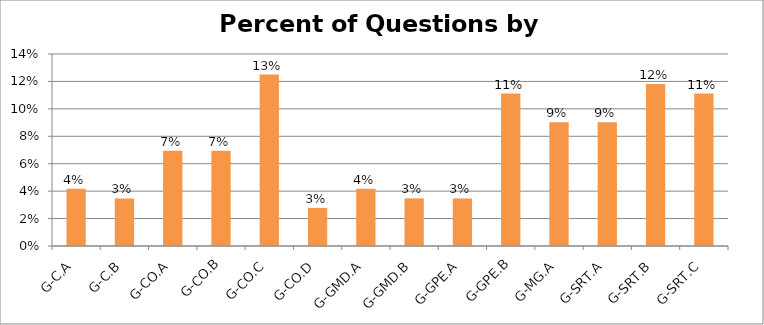
| Category | Percent of Questions |
|---|---|
| G-C.A | 0.042 |
| G-C.B | 0.035 |
| G-CO.A | 0.069 |
| G-CO.B | 0.069 |
| G-CO.C | 0.125 |
| G-CO.D | 0.028 |
| G-GMD.A | 0.042 |
| G-GMD.B | 0.035 |
| G-GPE.A | 0.035 |
| G-GPE.B | 0.111 |
| G-MG.A | 0.09 |
| G-SRT.A | 0.09 |
| G-SRT.B | 0.118 |
| G-SRT.C | 0.111 |